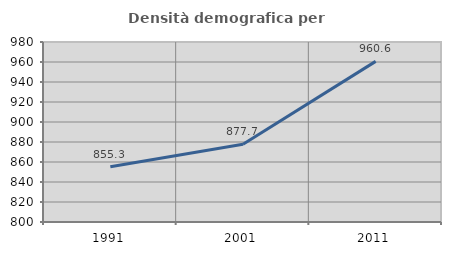
| Category | Densità demografica |
|---|---|
| 1991.0 | 855.279 |
| 2001.0 | 877.748 |
| 2011.0 | 960.615 |